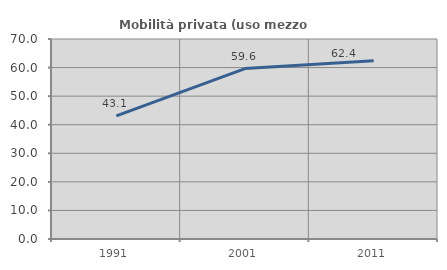
| Category | Mobilità privata (uso mezzo privato) |
|---|---|
| 1991.0 | 43.071 |
| 2001.0 | 59.641 |
| 2011.0 | 62.354 |